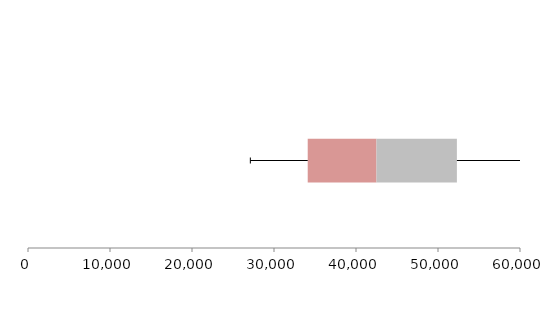
| Category | Series 1 | Series 2 | Series 3 |
|---|---|---|---|
| 0 | 34112.377 | 8386.198 | 9805.443 |